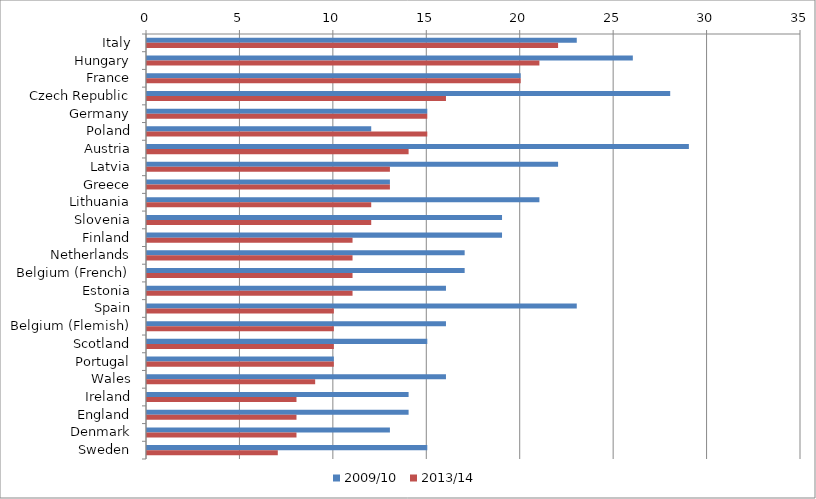
| Category | 2009/10 | 2013/14 |
|---|---|---|
| Italy | 23 | 22 |
| Hungary | 26 | 21 |
| France | 20 | 20 |
| Czech Republic | 28 | 16 |
| Germany | 15 | 15 |
| Poland | 12 | 15 |
| Austria | 29 | 14 |
| Latvia | 22 | 13 |
| Greece | 13 | 13 |
| Lithuania | 21 | 12 |
| Slovenia | 19 | 12 |
| Finland | 19 | 11 |
| Netherlands | 17 | 11 |
| Belgium (French) | 17 | 11 |
| Estonia | 16 | 11 |
| Spain | 23 | 10 |
| Belgium (Flemish) | 16 | 10 |
| Scotland | 15 | 10 |
| Portugal | 10 | 10 |
| Wales | 16 | 9 |
| Ireland | 14 | 8 |
| England | 14 | 8 |
| Denmark | 13 | 8 |
| Sweden | 15 | 7 |